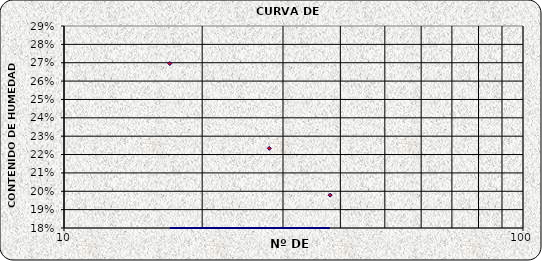
| Category | Series 0 |
|---|---|
| 38.0 | 0.198 |
| 28.0 | 0.223 |
| 17.0 | 0.27 |